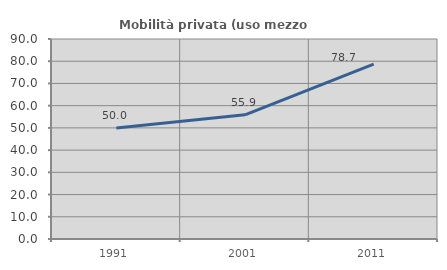
| Category | Mobilità privata (uso mezzo privato) |
|---|---|
| 1991.0 | 50 |
| 2001.0 | 55.862 |
| 2011.0 | 78.667 |